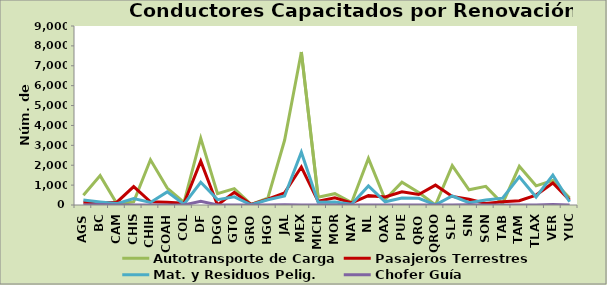
| Category | Autotransporte de Carga | Pasajeros Terrestres | Mat. y Residuos Pelig. | Chofer Guía |
|---|---|---|---|---|
| AGS | 489 | 137 | 249 | 0 |
| BC | 1477 | 107 | 153 | 23 |
| CAM | 60 | 140 | 70 | 2 |
| CHIS | 156 | 928 | 328 | 3 |
| CHIH | 2274 | 158 | 125 | 0 |
| COAH | 851 | 134 | 659 | 0 |
| COL | 135 | 90 | 41 | 2 |
| DF | 3357 | 2203 | 1144 | 189 |
| DGO | 573 | 0 | 270 | 0 |
| GTO | 824 | 640 | 410 | 0 |
| GRO | 36 | 24 | 11 | 0 |
| HGO | 345 | 295 | 261 | 0 |
| JAL | 3254 | 612 | 449 | 13 |
| MEX | 7691 | 1909 | 2654 | 0 |
| MICH | 390 | 186 | 138 | 0 |
| MOR | 570 | 359 | 154 | 0 |
| NAY | 126 | 104 | 42 | 0 |
| NL | 2344 | 471 | 958 | 0 |
| OAX | 270 | 402 | 161 | 0 |
| PUE | 1145 | 666 | 348 | 0 |
| QRO | 630 | 530 | 339 | 0 |
| QROO | 0 | 999 | 7 | 0 |
| SLP | 1978 | 433 | 452 | 0 |
| SIN | 764 | 292 | 120 | 7 |
| SON | 936 | 78 | 254 | 0 |
| TAB | 69 | 158 | 343 | 0 |
| TAM | 1947 | 218 | 1414 | 0 |
| TLAX | 965 | 499 | 402 | 0 |
| VER | 1231 | 1109 | 1501 | 28 |
| YUC | 353 | 246 | 166 | 3 |